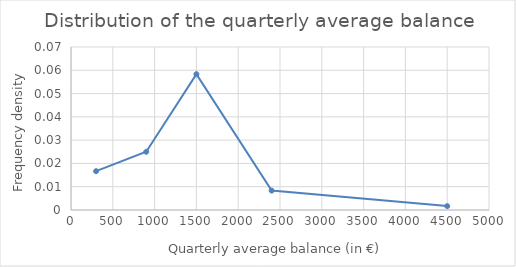
| Category | Series 0 |
|---|---|
| 300.0 | 0.017 |
| 900.0 | 0.025 |
| 1500.0 | 0.058 |
| 2400.0 | 0.008 |
| 4500.0 | 0.002 |